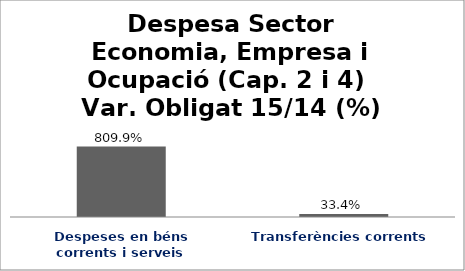
| Category | Series 0 |
|---|---|
| Despeses en béns corrents i serveis | 8.099 |
| Transferències corrents | 0.334 |